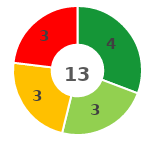
| Category | Series 0 |
|---|---|
| 0 | 4 |
| 1 | 3 |
| 2 | 3 |
| 3 | 3 |
| 4 | 0 |